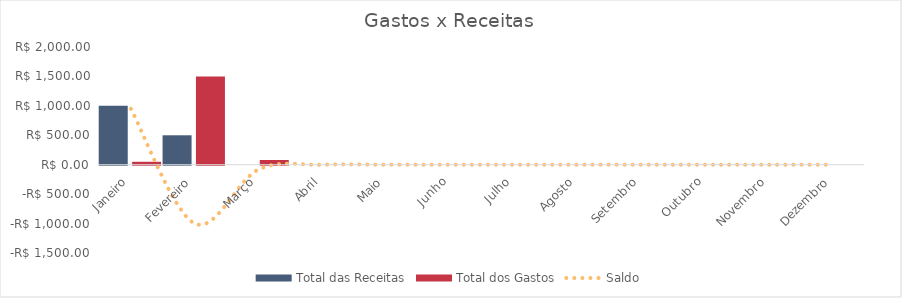
| Category | Total das Receitas | Total dos Gastos |
|---|---|---|
| Janeiro | 1000 | 50 |
| Fevereiro | 500 | 1500 |
| Março | 0 | 80 |
| Abril | 0 | 0 |
| Maio | 0 | 0 |
| Junho | 0 | 0 |
| Julho | 0 | 0 |
| Agosto | 0 | 0 |
| Setembro | 0 | 0 |
| Outubro | 0 | 0 |
| Novembro | 0 | 0 |
| Dezembro | 0 | 0 |